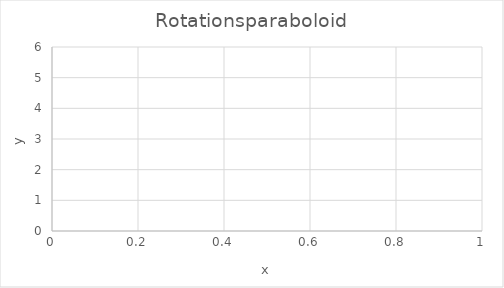
| Category | Flüssigkeitsspiegel |
|---|---|
| 0 | 0.936 |
| 1 | 0.936 |
| 2 | 0.937 |
| 3 | 0.939 |
| 4 | 0.942 |
| 5 | 0.946 |
| 6 | 0.951 |
| 7 | 0.956 |
| 8 | 0.962 |
| 9 | 0.969 |
| 10 | 0.977 |
| 11 | 0.986 |
| 12 | 0.995 |
| 13 | 1.006 |
| 14 | 1.017 |
| 15 | 1.029 |
| 16 | 1.041 |
| 17 | 1.055 |
| 18 | 1.07 |
| 19 | 1.085 |
| 20 | 1.101 |
| 21 | 1.118 |
| 22 | 1.136 |
| 23 | 1.154 |
| 24 | 1.174 |
| 25 | 1.194 |
| 26 | 1.215 |
| 27 | 1.237 |
| 28 | 1.259 |
| 29 | 1.283 |
| 30 | 1.307 |
| 31 | 1.333 |
| 32 | 1.359 |
| 33 | 1.385 |
| 34 | 1.413 |
| 35 | 1.442 |
| 36 | 1.471 |
| 37 | 1.501 |
| 38 | 1.532 |
| 39 | 1.564 |
| 40 | 1.596 |
| 41 | 1.63 |
| 42 | 1.664 |
| 43 | 1.699 |
| 44 | 1.735 |
| 45 | 1.772 |
| 46 | 1.809 |
| 47 | 1.848 |
| 48 | 1.887 |
| 49 | 1.927 |
| 50 | 1.968 |
| 51 | 2.01 |
| 52 | 2.052 |
| 53 | 2.095 |
| 54 | 2.14 |
| 55 | 2.185 |
| 56 | 2.23 |
| 57 | 2.277 |
| 58 | 2.325 |
| 59 | 2.373 |
| 60 | 2.422 |
| 61 | 2.472 |
| 62 | 2.523 |
| 63 | 2.574 |
| 64 | 2.627 |
| 65 | 2.68 |
| 66 | 2.734 |
| 67 | 2.789 |
| 68 | 2.845 |
| 69 | 2.901 |
| 70 | 2.959 |
| 71 | 3.017 |
| 72 | 3.076 |
| 73 | 3.136 |
| 74 | 3.197 |
| 75 | 3.258 |
| 76 | 3.32 |
| 77 | 3.384 |
| 78 | 3.448 |
| 79 | 3.512 |
| 80 | 3.578 |
| 81 | 3.644 |
| 82 | 3.712 |
| 83 | 3.78 |
| 84 | 3.849 |
| 85 | 3.919 |
| 86 | 3.989 |
| 87 | 4.061 |
| 88 | 4.133 |
| 89 | 4.206 |
| 90 | 4.28 |
| 91 | 4.355 |
| 92 | 4.43 |
| 93 | 4.506 |
| 94 | 4.584 |
| 95 | 4.662 |
| 96 | 4.741 |
| 97 | 4.82 |
| 98 | 4.901 |
| 99 | 4.982 |